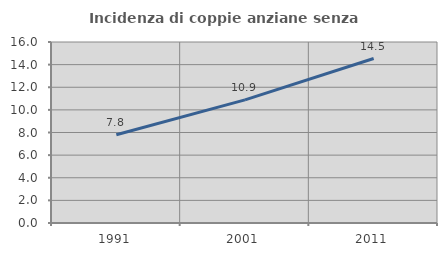
| Category | Incidenza di coppie anziane senza figli  |
|---|---|
| 1991.0 | 7.805 |
| 2001.0 | 10.88 |
| 2011.0 | 14.541 |